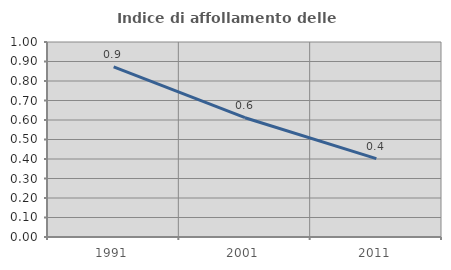
| Category | Indice di affollamento delle abitazioni  |
|---|---|
| 1991.0 | 0.873 |
| 2001.0 | 0.612 |
| 2011.0 | 0.402 |